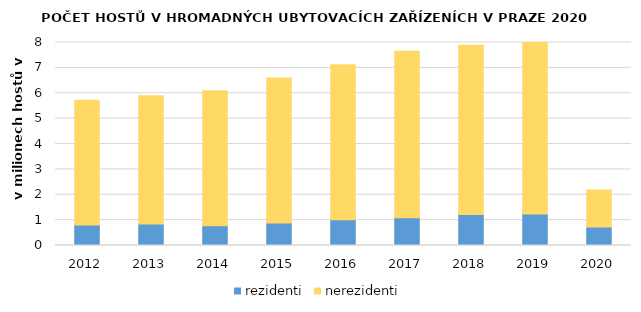
| Category | rezidenti | nerezidenti |
|---|---|---|
| 2012 | 806997 | 4919457 |
| 2013 | 851674 | 5047956 |
| 2014 | 780961 | 5315054 |
| 2015 | 890941 | 5714835 |
| 2016 | 1016796 | 6110762 |
| 2017 | 1090243 | 6562518 |
| 2018 | 1221478 | 6670706 |
| 2019 | 1240583 | 6803741 |
| 2020 | 728913 | 1453530 |